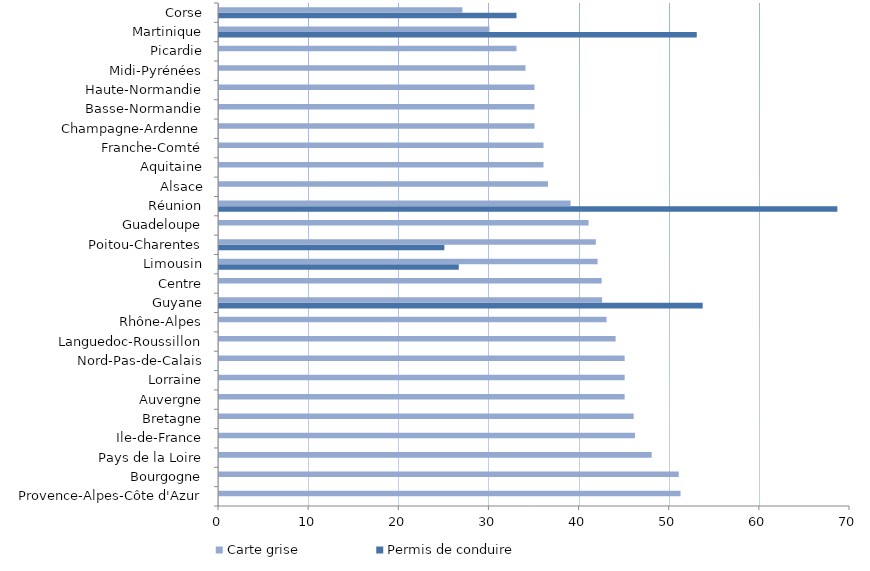
| Category | Permis de conduire | Carte grise |
|---|---|---|
| Provence-Alpes-Côte d'Azur | 0 | 51.2 |
| Bourgogne | 0 | 51 |
| Pays de la Loire | 0 | 48 |
| Ile-de-France | 0 | 46.15 |
| Bretagne | 0 | 46 |
| Auvergne | 0 | 45 |
| Lorraine | 0 | 45 |
| Nord-Pas-de-Calais | 0 | 45 |
| Languedoc-Roussillon | 0 | 44 |
| Rhône-Alpes | 0 | 43 |
| Guyane | 53.66 | 42.5 |
| Centre | 0 | 42.45 |
| Limousin | 26.6 | 42 |
| Poitou-Charentes | 25 | 41.8 |
| Guadeloupe | 0 | 41 |
| Réunion | 68.6 | 39 |
| Alsace | 0 | 36.5 |
| Aquitaine | 0 | 36 |
| Franche-Comté | 0 | 36 |
| Champagne-Ardenne | 0 | 35 |
| Basse-Normandie | 0 | 35 |
| Haute-Normandie | 0 | 35 |
| Midi-Pyrénées | 0 | 34 |
| Picardie | 0 | 33 |
| Martinique | 53 | 30 |
| Corse | 33 | 27 |